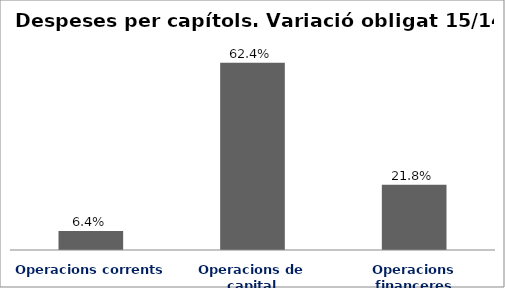
| Category | Series 0 |
|---|---|
| Operacions corrents | 0.064 |
| Operacions de capital | 0.624 |
| Operacions financeres | 0.218 |